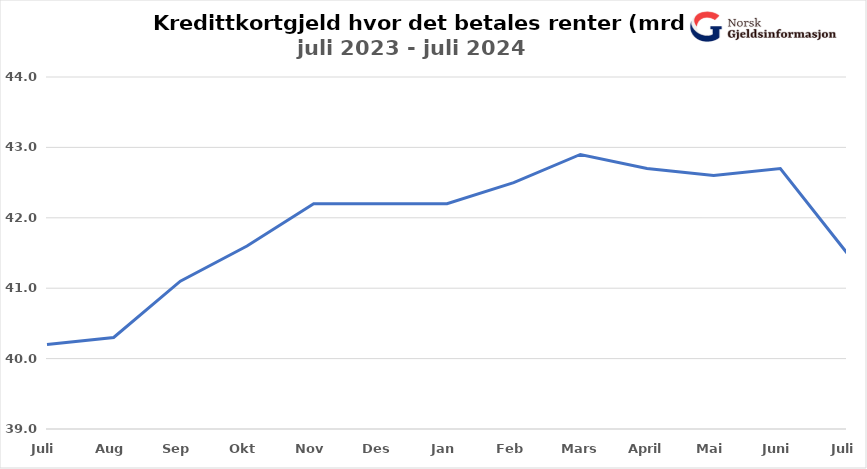
| Category | Rentebærende rammekreditt |
|---|---|
| Juli | 40.2 |
| Aug | 40.3 |
| Sep | 41.1 |
| Okt | 41.6 |
| Nov | 42.2 |
| Des | 42.2 |
| Jan | 42.2 |
| Feb | 42.5 |
| Mars | 42.9 |
| April | 42.7 |
| Mai | 42.6 |
| Juni | 42.7 |
| Juli | 41.5 |